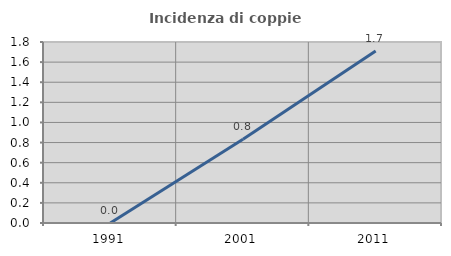
| Category | Incidenza di coppie miste |
|---|---|
| 1991.0 | 0 |
| 2001.0 | 0.833 |
| 2011.0 | 1.709 |